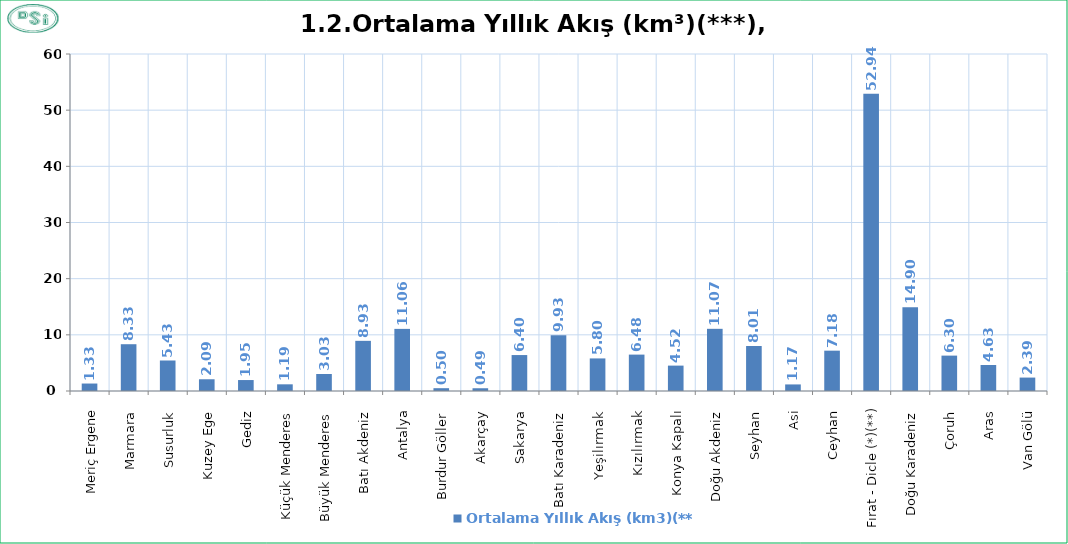
| Category | Ortalama Yıllık Akış (km3)(***) |
|---|---|
| Meriç Ergene | 1.33 |
| Marmara  | 8.33 |
| Susurluk  | 5.43 |
| Kuzey Ege  | 2.09 |
| Gediz  | 1.95 |
| Küçük Menderes  | 1.19 |
| Büyük Menderes  | 3.03 |
| Batı Akdeniz  | 8.93 |
| Antalya  | 11.06 |
| Burdur Göller  | 0.5 |
| Akarçay  | 0.49 |
| Sakarya  | 6.4 |
| Batı Karadeniz  | 9.93 |
| Yeşilırmak  | 5.8 |
| Kızılırmak  | 6.48 |
| Konya Kapalı  | 4.52 |
| Doğu Akdeniz  | 11.07 |
| Seyhan  | 8.01 |
| Asi  | 1.17 |
| Ceyhan  | 7.18 |
| Fırat - Dicle (*)(**) | 52.94 |
| Doğu Karadeniz  | 14.9 |
| Çoruh  | 6.3 |
| Aras  | 4.63 |
| Van Gölü  | 2.39 |